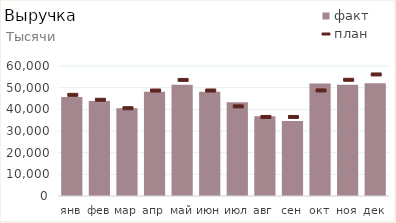
| Category | факт |
|---|---|
| янв | 45648000 |
| фев | 43886854.512 |
| мар | 40449089.025 |
| апр | 48063035.194 |
| май | 51309222.108 |
| июн | 48082262.331 |
| июл | 43306498.766 |
| авг | 36790501.54 |
| сен | 34654295.001 |
| окт | 51932283.419 |
| ноя | 51370823.969 |
| дек | 52072216.8 |